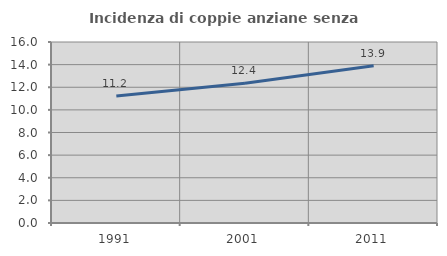
| Category | Incidenza di coppie anziane senza figli  |
|---|---|
| 1991.0 | 11.236 |
| 2001.0 | 12.353 |
| 2011.0 | 13.907 |